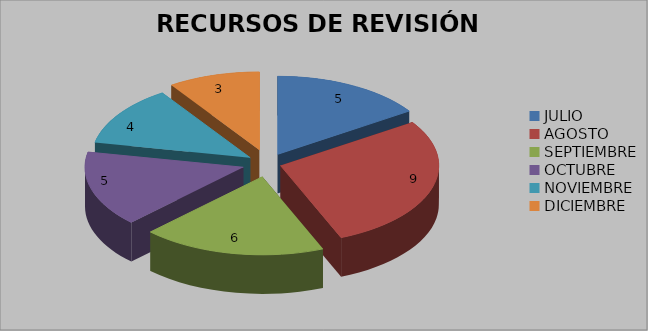
| Category | RECURSOS DE REVISIÓN |
|---|---|
| JULIO | 5 |
| AGOSTO | 9 |
| SEPTIEMBRE | 6 |
| OCTUBRE | 5 |
| NOVIEMBRE | 4 |
| DICIEMBRE | 3 |